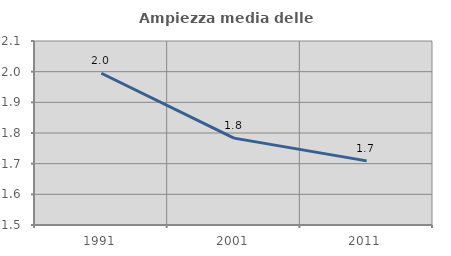
| Category | Ampiezza media delle famiglie |
|---|---|
| 1991.0 | 1.995 |
| 2001.0 | 1.783 |
| 2011.0 | 1.709 |